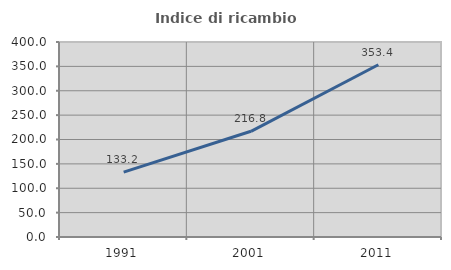
| Category | Indice di ricambio occupazionale  |
|---|---|
| 1991.0 | 133.194 |
| 2001.0 | 216.817 |
| 2011.0 | 353.409 |